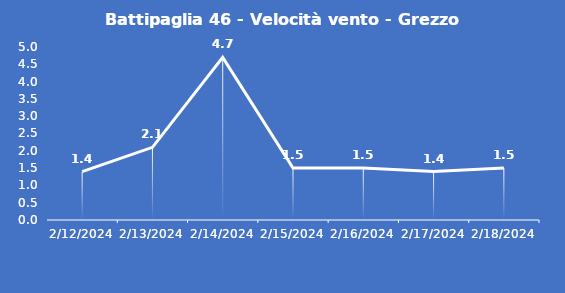
| Category | Battipaglia 46 - Velocità vento - Grezzo (m/s) |
|---|---|
| 2/12/24 | 1.4 |
| 2/13/24 | 2.1 |
| 2/14/24 | 4.7 |
| 2/15/24 | 1.5 |
| 2/16/24 | 1.5 |
| 2/17/24 | 1.4 |
| 2/18/24 | 1.5 |